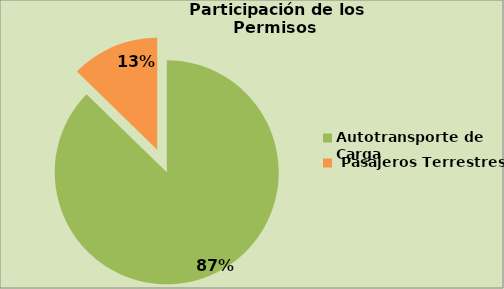
| Category | Series 0 |
|---|---|
| Autotransporte de Carga  | 87.282 |
|  Pasajeros Terrestres | 12.718 |